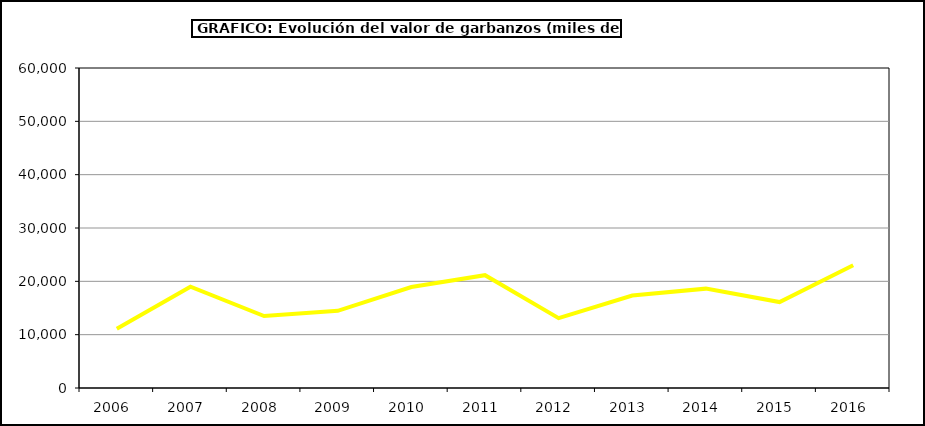
| Category | Valor |
|---|---|
| 2006.0 | 11089.58 |
| 2007.0 | 18993.342 |
| 2008.0 | 13484.51 |
| 2009.0 | 14465.658 |
| 2010.0 | 18938.847 |
| 2011.0 | 21152.702 |
| 2012.0 | 13103.626 |
| 2013.0 | 17341.152 |
| 2014.0 | 18630.56 |
| 2015.0 | 16111 |
| 2016.0 | 23017 |